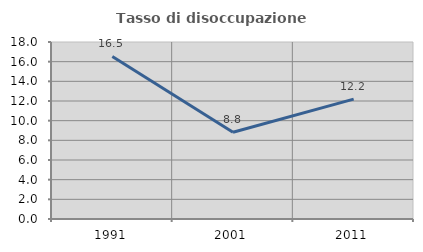
| Category | Tasso di disoccupazione giovanile  |
|---|---|
| 1991.0 | 16.529 |
| 2001.0 | 8.824 |
| 2011.0 | 12.195 |